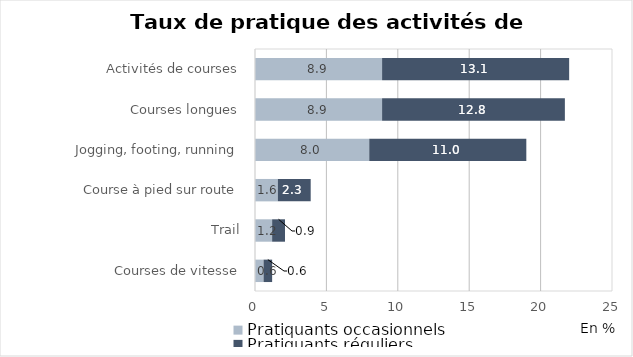
| Category | Pratiquants occasionnels | Pratiquants réguliers |
|---|---|---|
| Courses de vitesse | 0.6 | 0.6 |
| Trail | 1.2 | 0.9 |
| Course à pied sur route | 1.6 | 2.3 |
| Jogging, footing, running | 8 | 11 |
| Courses longues | 8.9 | 12.8 |
| Activités de courses | 8.9 | 13.1 |